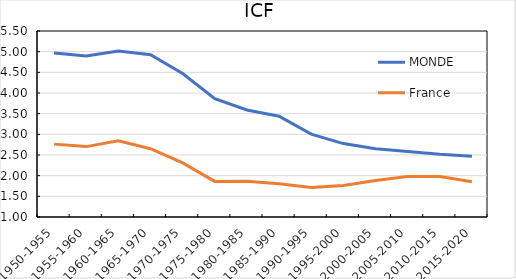
| Category | MONDE | France |
|---|---|---|
| 1950-1955 | 4.967 | 2.763 |
| 1955-1960 | 4.897 | 2.703 |
| 1960-1965 | 5.018 | 2.845 |
| 1965-1970 | 4.926 | 2.652 |
| 1970-1975 | 4.471 | 2.308 |
| 1975-1980 | 3.861 | 1.861 |
| 1980-1985 | 3.588 | 1.865 |
| 1985-1990 | 3.439 | 1.804 |
| 1990-1995 | 3.005 | 1.714 |
| 1995-2000 | 2.777 | 1.762 |
| 2000-2005 | 2.651 | 1.882 |
| 2005-2010 | 2.584 | 1.977 |
| 2010-2015 | 2.517 | 1.981 |
| 2015-2020 | 2.468 | 1.852 |